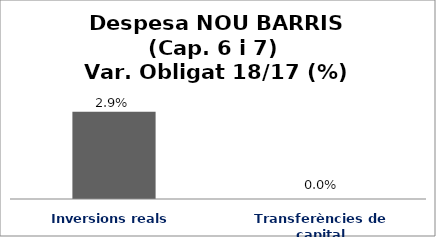
| Category | Series 0 |
|---|---|
| Inversions reals | 0.029 |
| Transferències de capital | 0 |